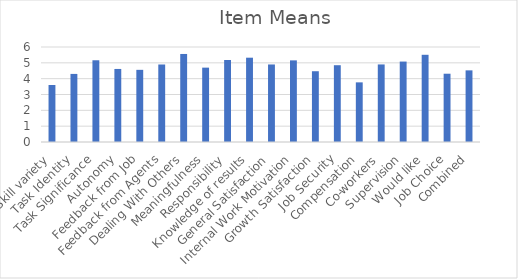
| Category | Mean |
|---|---|
| Skill variety | 3.6 |
| Task Identity | 4.3 |
| Task Significance | 5.162 |
| Autonomy | 4.613 |
| Feedback from Job | 4.557 |
| Feedback from Agents | 4.895 |
| Dealing With Others | 5.56 |
| Meaningfulness | 4.697 |
| Responsibility | 5.18 |
| Knowledge of results | 5.325 |
| General Satisfaction | 4.897 |
| Internal Work Motivation | 5.155 |
| Growth Satisfaction | 4.47 |
| Job Security | 4.85 |
| Compensation | 3.767 |
| Co-workers | 4.899 |
| Supervision | 5.08 |
| Would like | 5.508 |
| Job Choice | 4.313 |
| Combined | 4.525 |